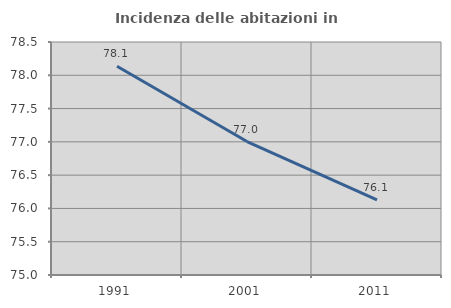
| Category | Incidenza delle abitazioni in proprietà  |
|---|---|
| 1991.0 | 78.136 |
| 2001.0 | 77.005 |
| 2011.0 | 76.128 |